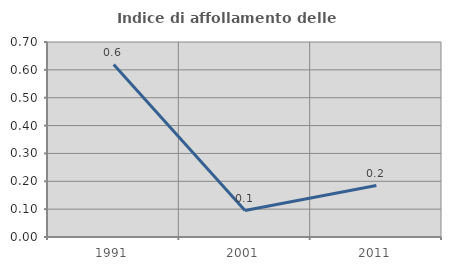
| Category | Indice di affollamento delle abitazioni  |
|---|---|
| 1991.0 | 0.619 |
| 2001.0 | 0.095 |
| 2011.0 | 0.185 |